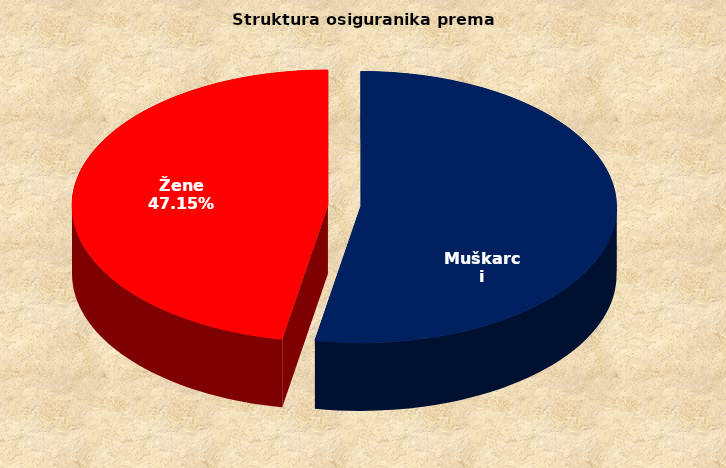
| Category | Series 0 |
|---|---|
| Muškarci | 865217 |
| Žene | 771754 |